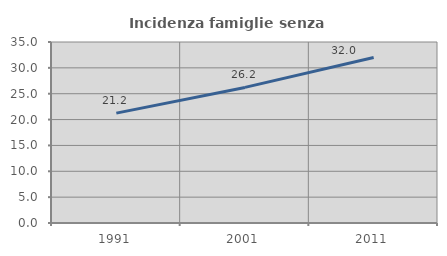
| Category | Incidenza famiglie senza nuclei |
|---|---|
| 1991.0 | 21.241 |
| 2001.0 | 26.219 |
| 2011.0 | 31.988 |